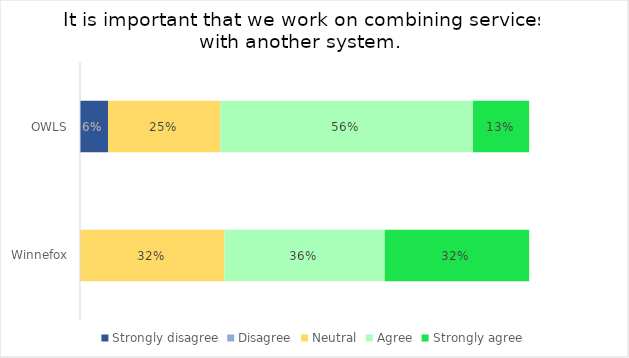
| Category | Strongly disagree | Disagree | Neutral | Agree | Strongly agree |
|---|---|---|---|---|---|
| OWLS | 0.062 | 0 | 0.25 | 0.562 | 0.125 |
| Winnefox | 0 | 0 | 0.321 | 0.357 | 0.321 |